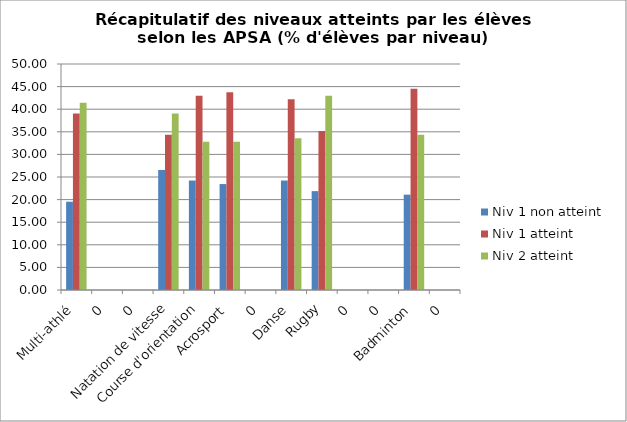
| Category | Niv 1 non atteint | Niv 1 atteint | Niv 2 atteint |
|---|---|---|---|
| Multi-athlé | 19.531 | 39.062 | 41.406 |
| 0 | 0 | 0 | 0 |
| 0 | 0 | 0 | 0 |
| Natation de vitesse | 26.562 | 34.375 | 39.062 |
| Course d'orientation | 24.219 | 42.969 | 32.812 |
| Acrosport | 23.438 | 43.75 | 32.812 |
| 0 | 0 | 0 | 0 |
| Danse | 24.219 | 42.188 | 33.594 |
| Rugby | 21.875 | 35.156 | 42.969 |
| 0 | 0 | 0 | 0 |
| 0 | 0 | 0 | 0 |
| Badminton | 21.094 | 44.531 | 34.375 |
| 0 | 0 | 0 | 0 |